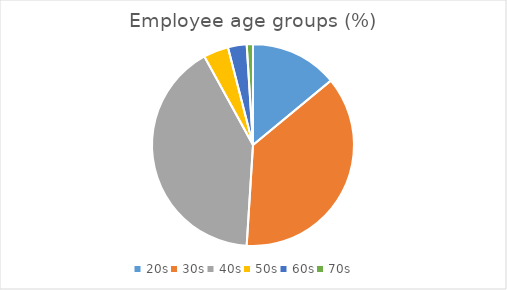
| Category | Employee age groups (%) |
|---|---|
| 20s | 0.14 |
| 30s | 0.37 |
| 40s | 0.41 |
| 50s | 0.04 |
| 60s | 0.03 |
| 70s | 0.01 |